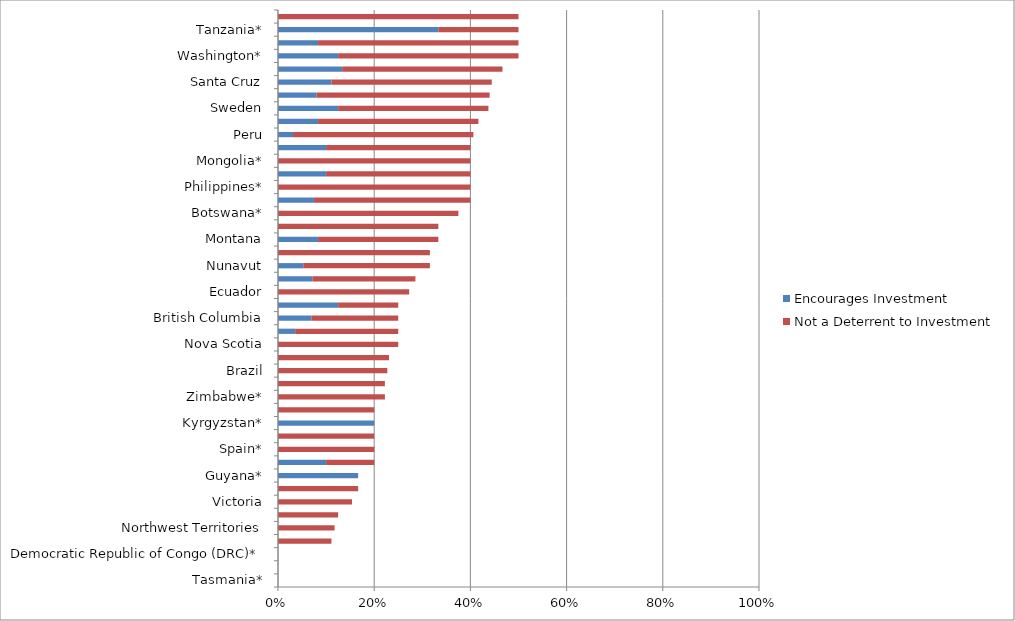
| Category | Encourages Investment | Not a Deterrent to Investment |
|---|---|---|
| Tasmania* | 0 | 0 |
| New Zealand* | 0 | 0 |
| Democratic Republic of Congo (DRC)* | 0 | 0 |
| Venezuela* | 0 | 0.111 |
| Northwest Territories | 0 | 0.118 |
| Nicaragua* | 0 | 0.125 |
| Victoria | 0 | 0.154 |
| Panama* | 0 | 0.167 |
| Guyana* | 0.167 | 0 |
| Turkey | 0.1 | 0.1 |
| Spain* | 0 | 0.2 |
| Michigan* | 0 | 0.2 |
| Kyrgyzstan* | 0.2 | 0 |
| California | 0 | 0.2 |
| Zimbabwe* | 0 | 0.222 |
| Mendoza* | 0 | 0.222 |
| Brazil | 0 | 0.227 |
| Chubut | 0 | 0.231 |
| Nova Scotia | 0 | 0.25 |
| Manitoba | 0.036 | 0.214 |
| British Columbia | 0.069 | 0.181 |
| Bolivia | 0.125 | 0.125 |
| Ecuador | 0 | 0.273 |
| New South Wales | 0.071 | 0.214 |
| Nunavut | 0.053 | 0.263 |
| Colorado | 0 | 0.316 |
| Montana | 0.083 | 0.25 |
| Minnesota* | 0 | 0.333 |
| Botswana* | 0 | 0.375 |
| Yukon | 0.075 | 0.325 |
| Philippines* | 0 | 0.4 |
| Norway | 0.1 | 0.3 |
| Mongolia* | 0 | 0.4 |
| Mali* | 0.1 | 0.3 |
| Peru | 0.031 | 0.375 |
| Indonesia | 0.083 | 0.333 |
| Sweden | 0.125 | 0.312 |
| Queensland | 0.08 | 0.36 |
| Santa Cruz | 0.111 | 0.333 |
| Northern Territory | 0.133 | 0.333 |
| Washington* | 0.125 | 0.375 |
| Utah | 0.083 | 0.417 |
| Tanzania* | 0.333 | 0.167 |
| South Africa | 0 | 0.5 |